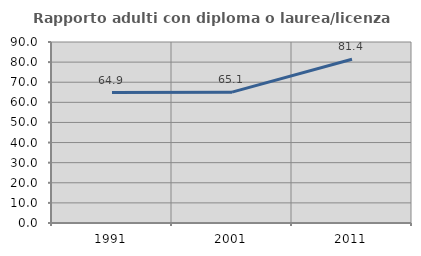
| Category | Rapporto adulti con diploma o laurea/licenza media  |
|---|---|
| 1991.0 | 64.865 |
| 2001.0 | 65.07 |
| 2011.0 | 81.429 |